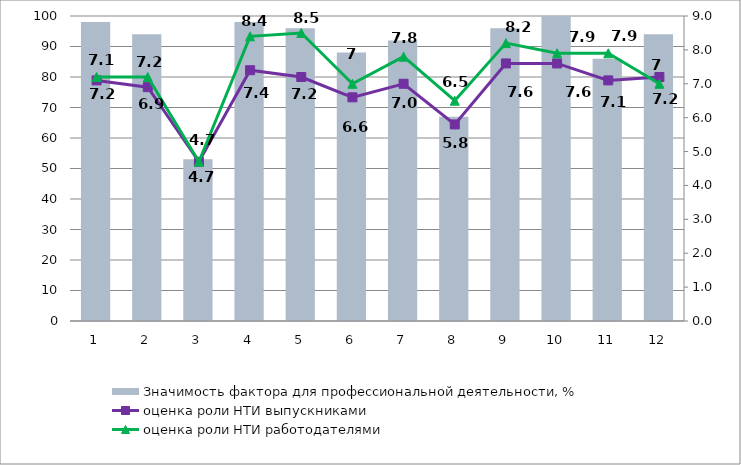
| Category | Значимость фактора для профессиональной деятельности, % |
|---|---|
| 1.0 | 98 |
| 2.0 | 94 |
| 3.0 | 53 |
| 4.0 | 98 |
| 5.0 | 96 |
| 6.0 | 88 |
| 7.0 | 92 |
| 8.0 | 67 |
| 9.0 | 96 |
| 10.0 | 100 |
| 11.0 | 86 |
| 12.0 | 94 |